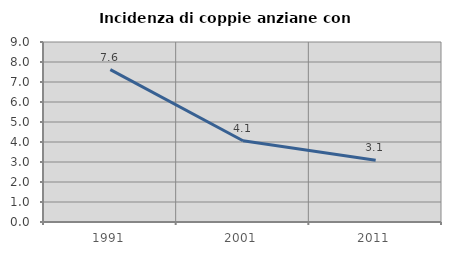
| Category | Incidenza di coppie anziane con figli |
|---|---|
| 1991.0 | 7.619 |
| 2001.0 | 4.065 |
| 2011.0 | 3.093 |